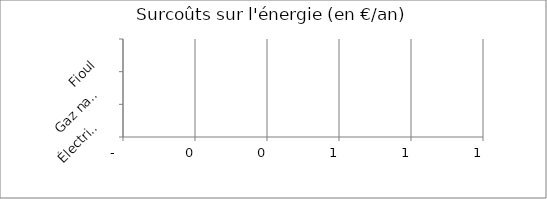
| Category | surcoûts en € |
|---|---|
| Électricité | 0 |
| Gaz naturel | 0 |
| Fioul | 0 |